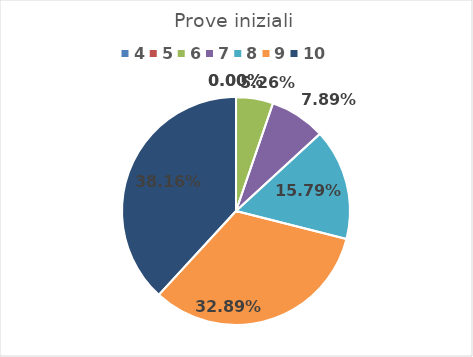
| Category | Series 0 |
|---|---|
| 4.0 | 0 |
| 5.0 | 0 |
| 6.0 | 0.053 |
| 7.0 | 0.079 |
| 8.0 | 0.158 |
| 9.0 | 0.329 |
| 10.0 | 0.382 |